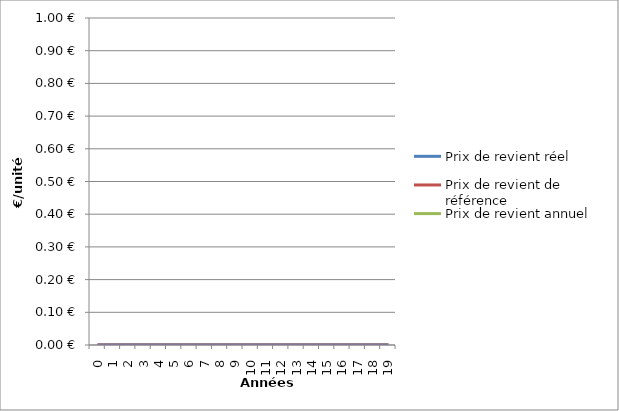
| Category | Prix de revient réel | Prix de revient de référence | Prix de revient annuel | Prix de revient prévisonnel |
|---|---|---|---|---|
| 0.0 | 0 | 0 | 0 | 0 |
| 1.0 | 0 | 0 | 0 | 0 |
| 2.0 | 0 | 0 | 0 | 0 |
| 3.0 | 0 | 0 | 0 | 0 |
| 4.0 | 0 | 0 | 0 | 0 |
| 5.0 | 0 | 0 | 0 | 0 |
| 6.0 | 0 | 0 | 0 | 0 |
| 7.0 | 0 | 0 | 0 | 0 |
| 8.0 | 0 | 0 | 0 | 0 |
| 9.0 | 0 | 0 | 0 | 0 |
| 10.0 | 0 | 0 | 0 | 0 |
| 11.0 | 0 | 0 | 0 | 0 |
| 12.0 | 0 | 0 | 0 | 0 |
| 13.0 | 0 | 0 | 0 | 0 |
| 14.0 | 0 | 0 | 0 | 0 |
| 15.0 | 0 | 0 | 0 | 0 |
| 16.0 | 0 | 0 | 0 | 0 |
| 17.0 | 0 | 0 | 0 | 0 |
| 18.0 | 0 | 0 | 0 | 0 |
| 19.0 | 0 | 0 | 0 | 0 |